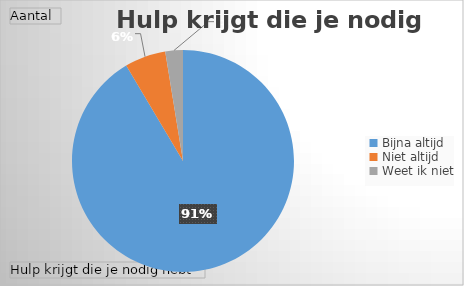
| Category | Totaal |
|---|---|
| Bijna altijd | 107 |
| Niet altijd | 7 |
| Weet ik niet | 3 |